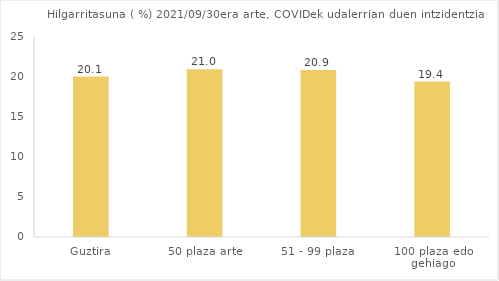
| Category | Series 0 |
|---|---|
| Guztira | 20.055 |
| 50 plaza arte | 20.955 |
| 51 - 99 plaza | 20.89 |
| 100 plaza edo gehiago | 19.435 |